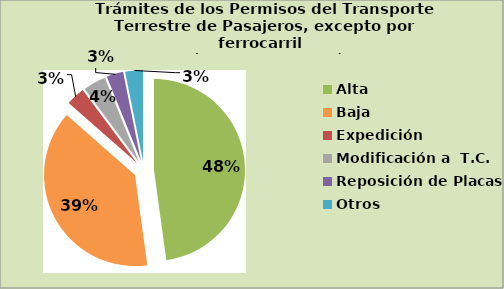
| Category | Series 0 |
|---|---|
| Alta                                         | 47.838 |
| Baja | 38.641 |
| Expedición | 3.345 |
| Modificación a  T.C. | 4.056 |
| Reposición de Placas | 2.961 |
| Otros | 3.159 |